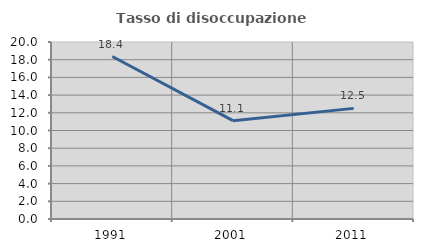
| Category | Tasso di disoccupazione giovanile  |
|---|---|
| 1991.0 | 18.361 |
| 2001.0 | 11.111 |
| 2011.0 | 12.5 |